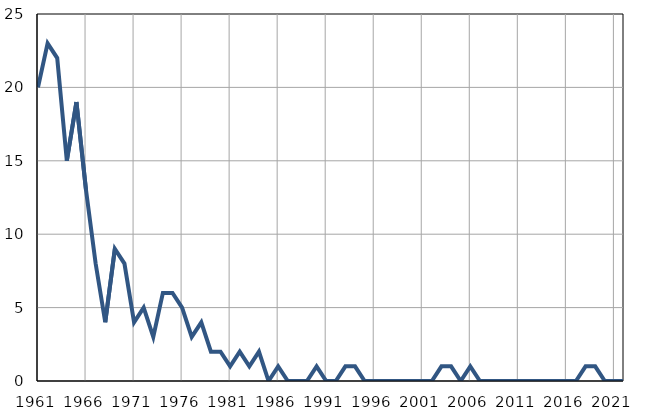
| Category | Infants
deaths |
|---|---|
| 1961.0 | 20 |
| 1962.0 | 23 |
| 1963.0 | 22 |
| 1964.0 | 15 |
| 1965.0 | 19 |
| 1966.0 | 13 |
| 1967.0 | 8 |
| 1968.0 | 4 |
| 1969.0 | 9 |
| 1970.0 | 8 |
| 1971.0 | 4 |
| 1972.0 | 5 |
| 1973.0 | 3 |
| 1974.0 | 6 |
| 1975.0 | 6 |
| 1976.0 | 5 |
| 1977.0 | 3 |
| 1978.0 | 4 |
| 1979.0 | 2 |
| 1980.0 | 2 |
| 1981.0 | 1 |
| 1982.0 | 2 |
| 1983.0 | 1 |
| 1984.0 | 2 |
| 1985.0 | 0 |
| 1986.0 | 1 |
| 1987.0 | 0 |
| 1988.0 | 0 |
| 1989.0 | 0 |
| 1990.0 | 1 |
| 1991.0 | 0 |
| 1992.0 | 0 |
| 1993.0 | 1 |
| 1994.0 | 1 |
| 1995.0 | 0 |
| 1996.0 | 0 |
| 1997.0 | 0 |
| 1998.0 | 0 |
| 1999.0 | 0 |
| 2000.0 | 0 |
| 2001.0 | 0 |
| 2002.0 | 0 |
| 2003.0 | 1 |
| 2004.0 | 1 |
| 2005.0 | 0 |
| 2006.0 | 1 |
| 2007.0 | 0 |
| 2008.0 | 0 |
| 2009.0 | 0 |
| 2010.0 | 0 |
| 2011.0 | 0 |
| 2012.0 | 0 |
| 2013.0 | 0 |
| 2014.0 | 0 |
| 2015.0 | 0 |
| 2016.0 | 0 |
| 2017.0 | 0 |
| 2018.0 | 1 |
| 2019.0 | 1 |
| 2020.0 | 0 |
| 2021.0 | 0 |
| 2022.0 | 0 |